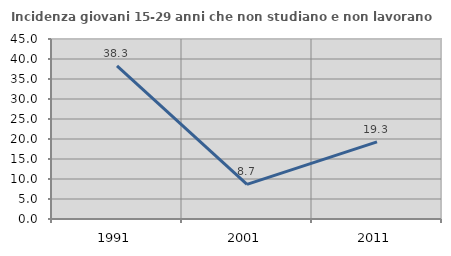
| Category | Incidenza giovani 15-29 anni che non studiano e non lavorano  |
|---|---|
| 1991.0 | 38.269 |
| 2001.0 | 8.661 |
| 2011.0 | 19.277 |